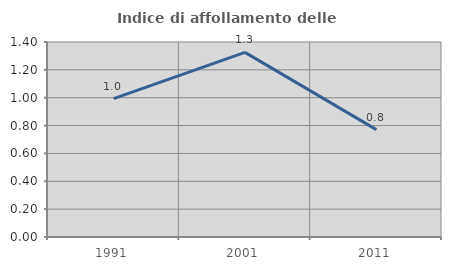
| Category | Indice di affollamento delle abitazioni  |
|---|---|
| 1991.0 | 0.994 |
| 2001.0 | 1.325 |
| 2011.0 | 0.771 |